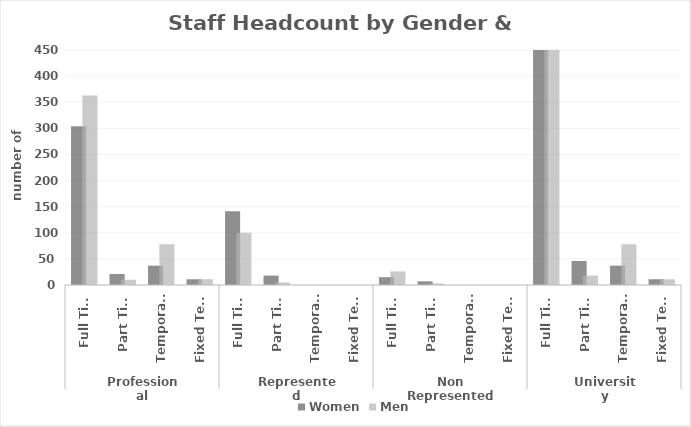
| Category | Women  | Men  |
|---|---|---|
| 0 | 304 | 363 |
| 1 | 21 | 10 |
| 2 | 37 | 78 |
| 3 | 11 | 11 |
| 4 | 141 | 100 |
| 5 | 18 | 5 |
| 6 | 0 | 0 |
| 7 | 0 | 0 |
| 8 | 15 | 26 |
| 9 | 7 | 3 |
| 10 | 0 | 0 |
| 11 | 0 | 0 |
| 12 | 460 | 489 |
| 13 | 46 | 18 |
| 14 | 37 | 78 |
| 15 | 11 | 11 |